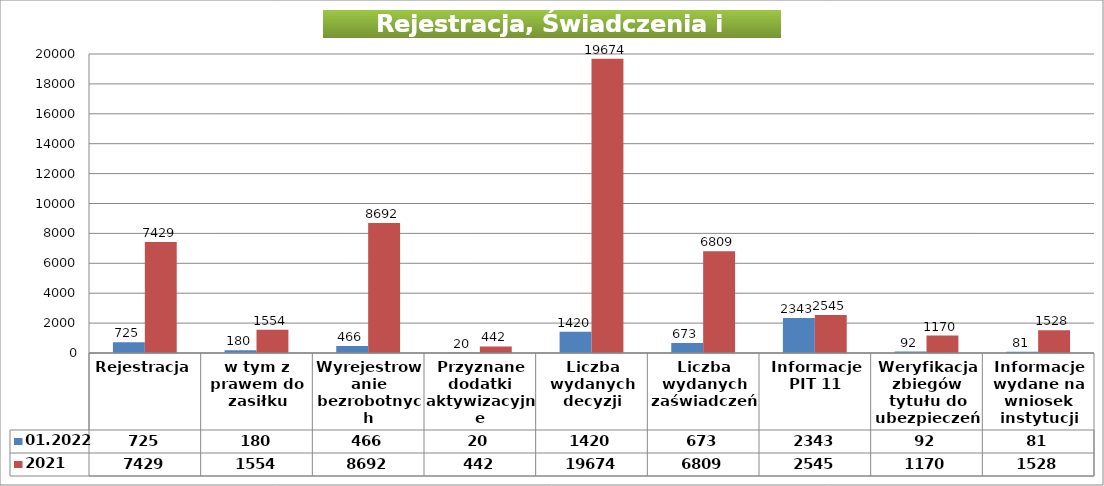
| Category | 01.2022 | 2021 |
|---|---|---|
| Rejestracja | 725 | 7429 |
| w tym z prawem do zasiłku | 180 | 1554 |
| Wyrejestrowanie bezrobotnych | 466 | 8692 |
| Przyznane dodatki aktywizacyjne | 20 | 442 |
| Liczba wydanych decyzji | 1420 | 19674 |
| Liczba wydanych zaświadczeń | 673 | 6809 |
| Informacje PIT 11 | 2343 | 2545 |
| Weryfikacja zbiegów tytułu do ubezpieczeń | 92 | 1170 |
| Informacje wydane na wniosek instytucji | 81 | 1528 |